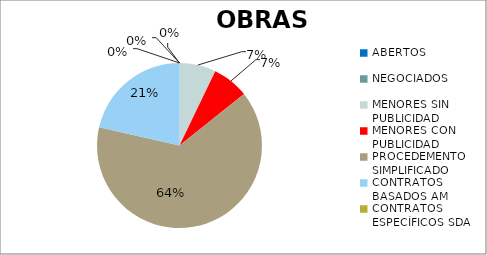
| Category | Series 0 |
|---|---|
| ABERTOS  | 0 |
| NEGOCIADOS  | 0 |
| MENORES SIN PUBLICIDAD | 0.071 |
| MENORES CON PUBLICIDAD | 0.071 |
| PROCEDEMENTO SIMPLIFICADO | 0.643 |
| CONTRATOS BASADOS AM | 0.214 |
| CONTRATOS ESPECÍFICOS SDA | 0 |